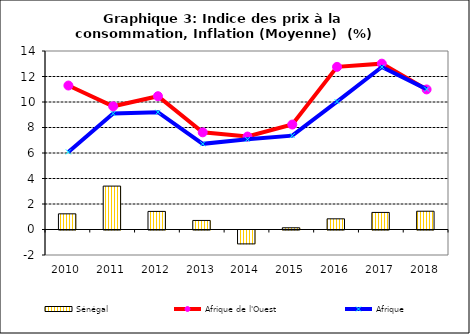
| Category | Sénégal |
|---|---|
| 2010.0 | 1.229 |
| 2011.0 | 3.403 |
| 2012.0 | 1.418 |
| 2013.0 | 0.71 |
| 2014.0 | -1.09 |
| 2015.0 | 0.135 |
| 2016.0 | 0.837 |
| 2017.0 | 1.338 |
| 2018.0 | 1.433 |